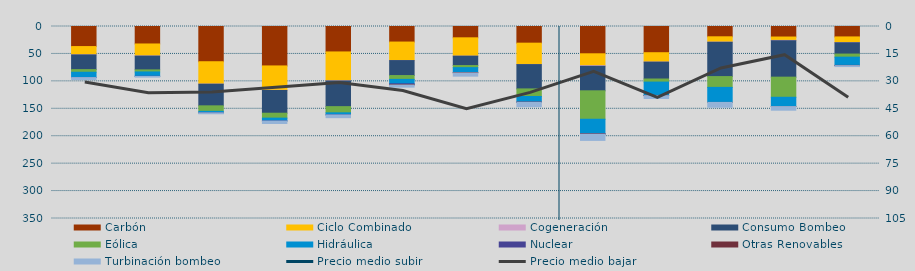
| Category | Carbón | Ciclo Combinado | Cogeneración | Consumo Bombeo | Eólica | Hidráulica | Nuclear | Otras Renovables | Turbinación bombeo |
|---|---|---|---|---|---|---|---|---|---|
| M | 36573.1 | 14965.8 | 259.5 | 26811.1 | 4780.9 | 9611.3 | 138 | 0 | 3683.8 |
| J | 31856.5 | 21784.2 | 332.6 | 25120.8 | 3742.7 | 7869.8 | 320 | 0 | 1244.9 |
| J | 64224.4 | 40730.5 | 223.6 | 39459.7 | 10048.7 | 2606.4 | 130 | 0 | 1680.4 |
| A | 71875.8 | 44407.8 | 356.8 | 41443.4 | 8916.4 | 5181.1 | 179.2 | 0 | 4517 |
| S | 46377.5 | 52485.1 | 420.2 | 46799.1 | 11262.5 | 3698.4 | 178.3 | 0 | 4969.7 |
| O | 28352.7 | 33701.8 | 72.5 | 27285.6 | 6968.9 | 8057.2 | 1524.1 | 736.2 | 3817.1 |
| N | 20637.7 | 33409.3 | 40.8 | 17072.8 | 3847.5 | 8820.4 | 0 | 757.7 | 5932.4 |
| D | 30371.3 | 38818.7 | 239.5 | 44331.3 | 13873.3 | 10280.7 | 108.3 | 133.8 | 8046.3 |
| E | 49749 | 21689 | 1091.7 | 44705.2 | 51833.3 | 26560.6 | 159.6 | 521.7 | 11348.4 |
| F | 47780.9 | 17066.1 | 83.8 | 30784 | 5603.4 | 24359.1 | 40 | 286.6 | 5220.7 |
| M | 18764.1 | 9673.8 | 444.5 | 62414.7 | 19679.2 | 27422.5 | 0 | 20.9 | 8766.8 |
| A | 19179.5 | 6106.3 | 488.3 | 66560.4 | 36687.3 | 16841.6 | 0 | 122 | 6609.5 |
| M | 18994.1 | 10277 | 353.4 | 20633.9 | 5611.8 | 15058.8 | 96.2 | 322.7 | 1709.2 |